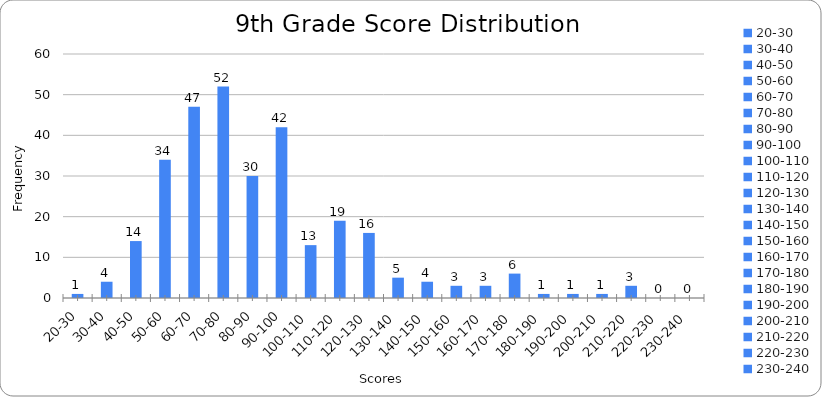
| Category | 0 |
|---|---|
| 20-30 | 1 |
| 30-40 | 4 |
| 40-50 | 14 |
| 50-60 | 34 |
| 60-70 | 47 |
| 70-80 | 52 |
| 80-90 | 30 |
| 90-100 | 42 |
| 100-110 | 13 |
| 110-120 | 19 |
| 120-130 | 16 |
| 130-140 | 5 |
| 140-150 | 4 |
| 150-160 | 3 |
| 160-170 | 3 |
| 170-180 | 6 |
| 180-190 | 1 |
| 190-200 | 1 |
| 200-210 | 1 |
| 210-220 | 3 |
| 220-230 | 0 |
| 230-240 | 0 |